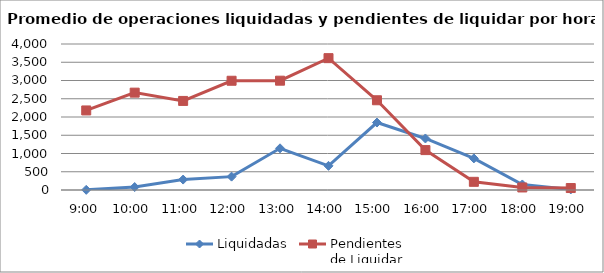
| Category | Liquidadas | Pendientes
de Liquidar |
|---|---|---|
| 0.375 | 4.55 | 2179.45 |
| 0.4166666666666667 | 80.5 | 2667.3 |
| 0.4583333333333333 | 285.75 | 2440.4 |
| 0.5 | 366.35 | 2993.05 |
| 0.5416666666666666 | 1142.1 | 2994.95 |
| 0.583333333333333 | 661.45 | 3612.3 |
| 0.625 | 1848.4 | 2458.6 |
| 0.666666666666667 | 1411.4 | 1093.2 |
| 0.708333333333333 | 865.95 | 224.05 |
| 0.75 | 151.7 | 69.65 |
| 0.791666666666667 | 15.7 | 53.7 |